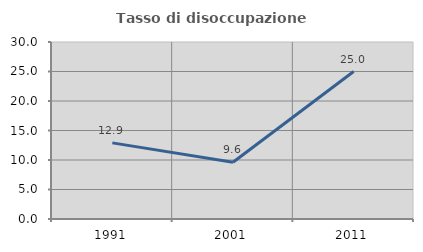
| Category | Tasso di disoccupazione giovanile  |
|---|---|
| 1991.0 | 12.903 |
| 2001.0 | 9.615 |
| 2011.0 | 25 |